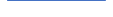
| Category | Series 0 |
|---|---|
| 0 | 0 |
| 1 | 2 |
| 2 | 1 |
| 3 | 1 |
| 4 | 0 |
| 5 | 0 |
| 6 | 1 |
| 7 | 2 |
| 8 | 1 |